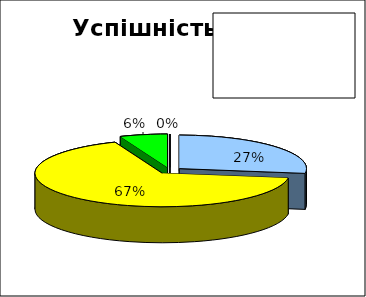
| Category | Series 0 |
|---|---|
| початковий | 0 |
| середній | 0.273 |
| достатній | 0.667 |
| високий | 0.061 |